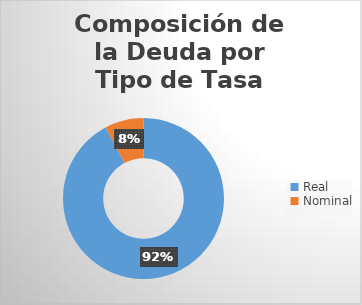
| Category | Series 0 |
|---|---|
| Real | 0.922 |
| Nominal | 0.078 |